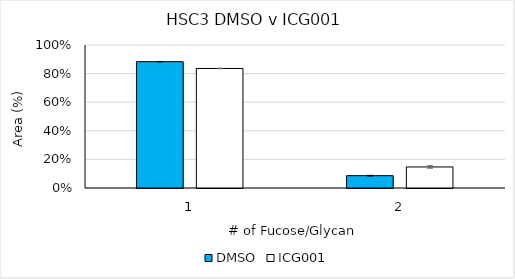
| Category | DMSO | ICG001 |
|---|---|---|
| 0 | 0.883 | 0.836 |
| 1 | 0.086 | 0.147 |